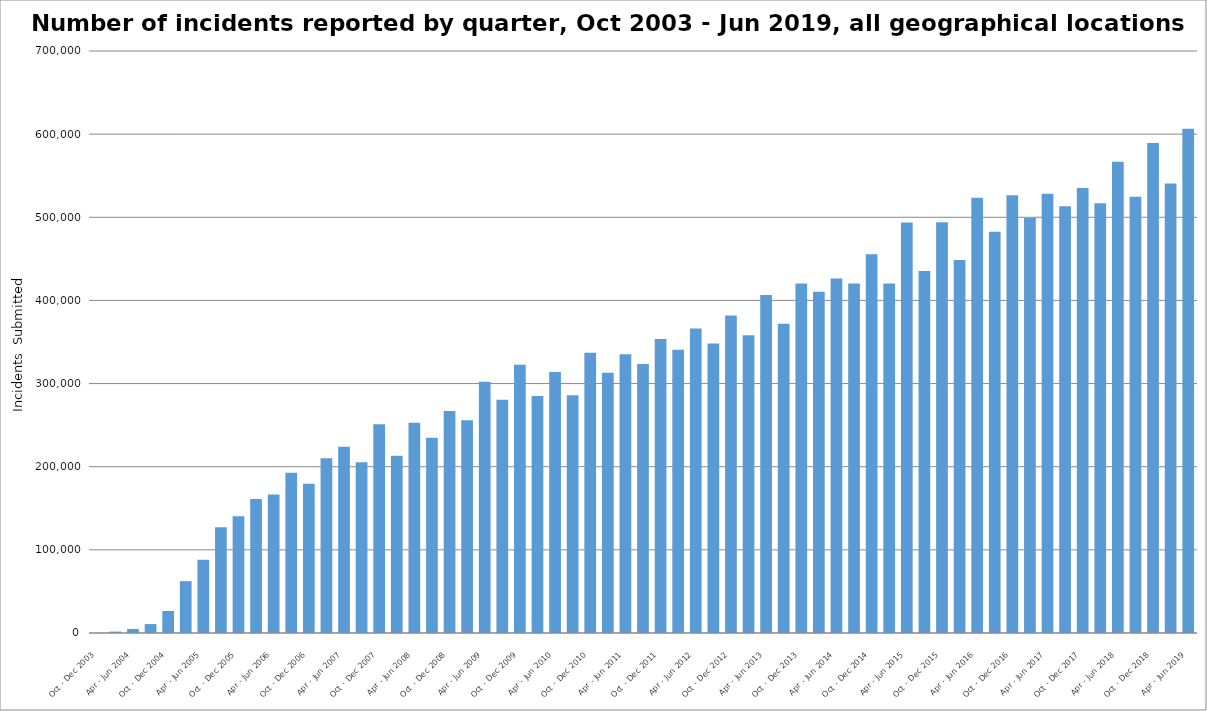
| Category | Wales |
|---|---|
| Oct - Dec 2003 | 158 |
| Jan - Mar 2004 | 1716 |
| Apr - Jun 2004 | 4823 |
| Jul - Sep 2004 | 10720 |
| Oct - Dec 2004 | 26508 |
| Jan - Mar 2005 | 62351 |
| Apr - Jun 2005 | 88042 |
| Jul - Sep 2005 | 127170 |
| Oct - Dec 2005 | 140394 |
| Jan - Mar 2006 | 161141 |
| Apr - Jun 2006 | 166539 |
| Jul - Sep 2006 | 192794 |
| Oct - Dec 2006 | 179538 |
| Jan - Mar 2007 | 210178 |
| Apr - Jun 2007 | 224047 |
| Jul - Sep 2007 | 205357 |
| Oct - Dec 2007 | 251010 |
| Jan - Mar 2008 | 213281 |
| Apr - Jun 2008 | 253006 |
| Jul - Sep 2008 | 234863 |
| Oct - Dec 2008 | 267135 |
| Jan - Mar 2009 | 255837 |
| Apr - Jun 2009 | 302198 |
| Jul - Sep 2009 | 280454 |
| Oct - Dec 2009 | 322757 |
| Jan - Mar 2010 | 284962 |
| Apr - Jun 2010 | 313827 |
| Jul - Sep 2010 | 286096 |
| Oct - Dec 2010 | 337149 |
| Jan - Mar 2011 | 312982 |
| Apr - Jun 2011 | 335327 |
| Jul - Sep 2011 | 323427 |
| Oct - Dec 2011 | 353578 |
| Jan - Mar 2012 | 340826 |
| Apr - Jun 2012 | 366262 |
| Jul - Sep 2012 | 348341 |
| Oct - Dec 2012 | 381754 |
| Jan - Mar 2013 | 358099 |
| Apr - Jun 2013 | 406617 |
| Jul - Sep 2013 | 372099 |
| Oct - Dec 2013 | 420297 |
| Jan - Mar 2014 | 410408 |
| Apr - Jun 2014 | 426315 |
| Jul - Sep 2014 | 420333 |
| Oct - Dec 2014 | 455584 |
| Jan - Mar 2015 | 420510 |
| Apr - Jun 2015 | 493795 |
| Jul - Sep 2015 | 435245 |
| Oct - Dec 2015 | 494082 |
| Jan - Mar 2016 | 448659 |
| Apr - Jun 2016 | 523610 |
| Jul - Sep 2016 | 482727 |
| Oct - Dec 2016 | 526580 |
| Jan - Mar 2017 | 499023 |
| Apr - Jun 2017 | 528164 |
| Jul - Sep 2017 | 513153 |
| Oct - Dec 2017 | 535229 |
| Jan - Mar 2018 | 516918 |
| Apr - Jun 2018 | 566898 |
| Jul - Sep 2018 | 524805 |
| Oct - Dec 2018 | 589471 |
| Jan - Mar 2019 | 540731 |
| Apr - Jun 2019 | 606613 |